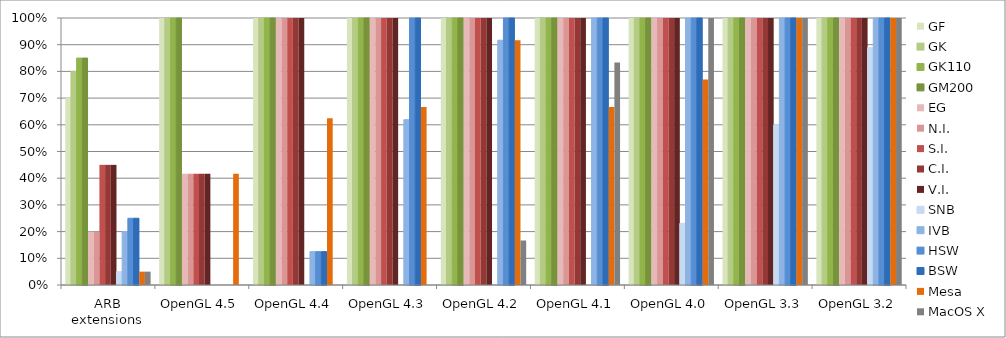
| Category | GF | GK | GK110 | GM200 | EG | N.I. | S.I. | C.I. | V.I. | SNB | IVB | HSW | BSW | Mesa | MacOS X |
|---|---|---|---|---|---|---|---|---|---|---|---|---|---|---|---|
| ARB extensions | 0.7 | 0.8 | 0.85 | 0.85 | 0.2 | 0.2 | 0.45 | 0.45 | 0.45 | 0.05 | 0.2 | 0.25 | 0.25 | 0.05 | 0.05 |
| OpenGL 4.5 | 1 | 1 | 1 | 1 | 0.417 | 0.417 | 0.417 | 0.417 | 0.417 | 0 | 0 | 0 | 0 | 0.417 | 0 |
| OpenGL 4.4 | 1 | 1 | 1 | 1 | 1 | 1 | 1 | 1 | 1 | 0 | 0.125 | 0.125 | 0.125 | 0.625 | 0 |
| OpenGL 4.3 | 1 | 1 | 1 | 1 | 1 | 1 | 1 | 1 | 1 | 0 | 0.619 | 1 | 1 | 0.667 | 0 |
| OpenGL 4.2 | 1 | 1 | 1 | 1 | 1 | 1 | 1 | 1 | 1 | 0 | 0.917 | 1 | 1 | 0.917 | 0.167 |
| OpenGL 4.1 | 1 | 1 | 1 | 1 | 1 | 1 | 1 | 1 | 1 | 0 | 1 | 1 | 1 | 0.667 | 0.833 |
| OpenGL 4.0 | 1 | 1 | 1 | 1 | 1 | 1 | 1 | 1 | 1 | 0.231 | 1 | 1 | 1 | 0.769 | 1 |
| OpenGL 3.3 | 1 | 1 | 1 | 1 | 1 | 1 | 1 | 1 | 1 | 0.6 | 1 | 1 | 1 | 1 | 1 |
| OpenGL 3.2 | 1 | 1 | 1 | 1 | 1 | 1 | 1 | 1 | 1 | 0.889 | 1 | 1 | 1 | 1 | 1 |